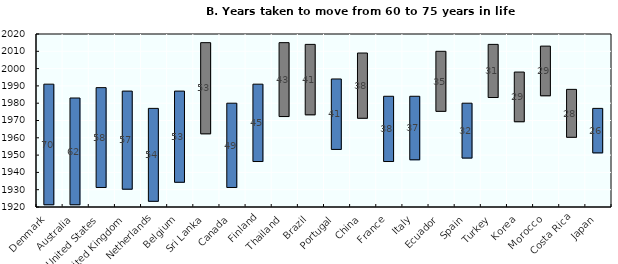
| Category | Series 0 | Series 1 |
|---|---|---|
| Denmark | 1921 | 70 |
| Australia | 1921 | 62 |
| United States | 1931 | 58 |
| United Kingdom | 1930 | 57 |
| Netherlands | 1923 | 54 |
| Belgium | 1934 | 53 |
| Sri Lanka | 1962 | 53 |
| Canada | 1931 | 49 |
| Finland | 1946 | 45 |
| Thailand | 1972 | 43 |
| Brazil | 1973 | 41 |
| Portugal | 1953 | 41 |
| China | 1971 | 38 |
| France | 1946 | 38 |
| Italy | 1947 | 37 |
| Ecuador | 1975 | 35 |
| Spain | 1948 | 32 |
| Turkey | 1983 | 31 |
| Korea | 1969 | 29 |
| Morocco | 1984 | 29 |
| Costa Rica | 1960 | 28 |
| Japan | 1951 | 26 |